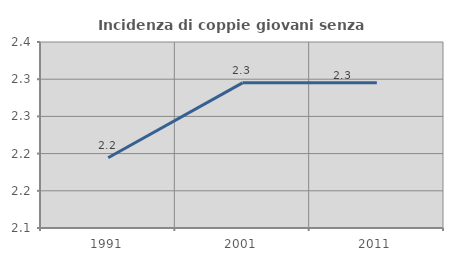
| Category | Incidenza di coppie giovani senza figli |
|---|---|
| 1991.0 | 2.194 |
| 2001.0 | 2.295 |
| 2011.0 | 2.295 |